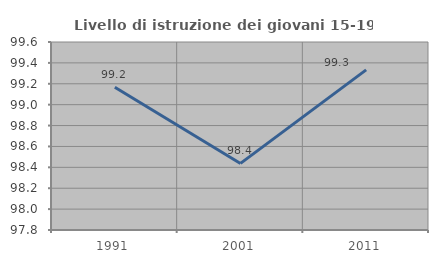
| Category | Livello di istruzione dei giovani 15-19 anni |
|---|---|
| 1991.0 | 99.167 |
| 2001.0 | 98.438 |
| 2011.0 | 99.333 |